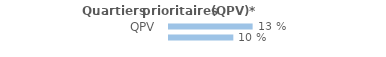
| Category | Series 0 |
|---|---|
| QPV | 0.13 |
| Hors QPV | 0.1 |